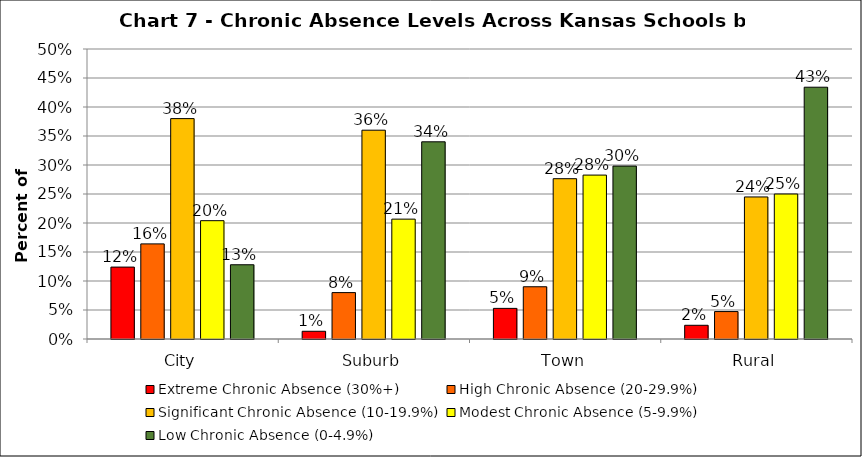
| Category | Extreme Chronic Absence (30%+) | High Chronic Absence (20-29.9%) | Significant Chronic Absence (10-19.9%) | Modest Chronic Absence (5-9.9%) | Low Chronic Absence (0-4.9%) |
|---|---|---|---|---|---|
| 0 | 0.124 | 0.164 | 0.38 | 0.204 | 0.128 |
| 1 | 0.013 | 0.08 | 0.36 | 0.207 | 0.34 |
| 2 | 0.053 | 0.09 | 0.276 | 0.283 | 0.298 |
| 3 | 0.024 | 0.047 | 0.245 | 0.25 | 0.434 |